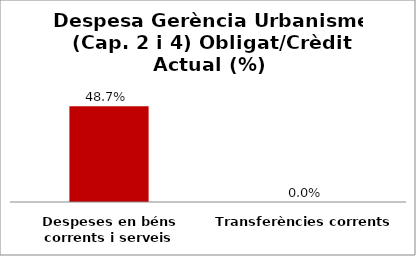
| Category | Series 0 |
|---|---|
| Despeses en béns corrents i serveis | 0.487 |
| Transferències corrents | 0 |